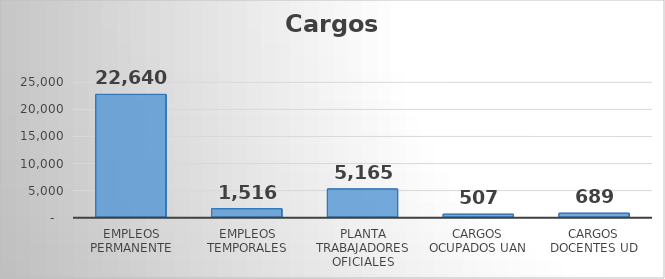
| Category | Series 0 |
|---|---|
| EMPLEOS PERMANENTE | 22640 |
| EMPLEOS TEMPORALES | 1516 |
| PLANTA TRABAJADORES OFICIALES | 5165 |
| CARGOS OCUPADOS UAN | 507 |
| CARGOS DOCENTES UD | 689 |